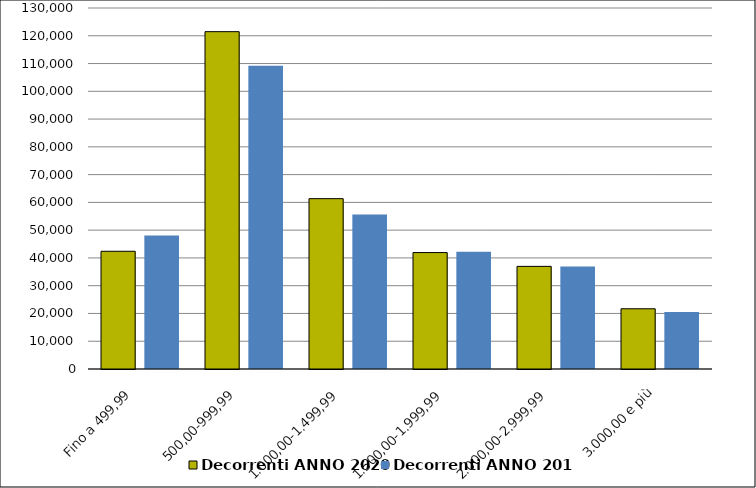
| Category | Decorrenti ANNO 2020 | Decorrenti ANNO 2019 |
|---|---|---|
| Fino a 499,99 | 42397 | 48055 |
| 500,00-999,99 | 121476 | 109240 |
| 1.000,00-1.499,99 | 61340 | 55671 |
| 1.500,00-1.999,99 | 41928 | 42247 |
| 2.000,00-2.999,99 | 36957 | 36914 |
| 3.000,00 e più | 21686 | 20538 |